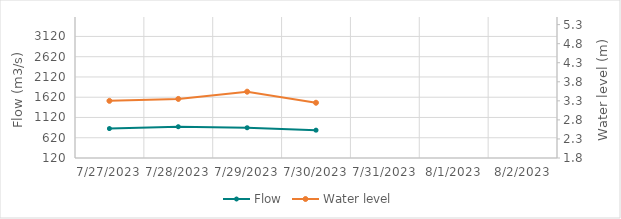
| Category | Flow |
|---|---|
| 5/11/23 | 1989.29 |
| 5/10/23 | 2025.65 |
| 5/9/23 | 2028.7 |
| 5/8/23 | 1903.33 |
| 5/7/23 | 1668.28 |
| 5/6/23 | 1382.92 |
| 5/5/23 | 1313.48 |